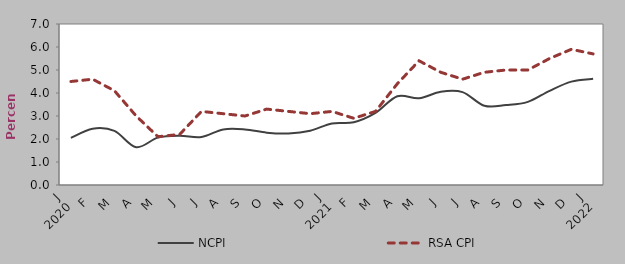
| Category | NCPI | RSA CPI |
|---|---|---|
| 0 | 2.05 | 4.5 |
| 1900-01-01 | 2.45 | 4.6 |
| 1900-01-02 | 2.354 | 4.1 |
| 1900-01-03 | 1.643 | 3 |
| 1900-01-04 | 2.06 | 2.1 |
| 1900-01-05 | 2.145 | 2.2 |
| 1900-01-06 | 2.087 | 3.2 |
| 1900-01-07 | 2.416 | 3.1 |
| 1900-01-08 | 2.416 | 3 |
| 1900-01-09 | 2.277 | 3.3 |
| 1900-01-10 | 2.242 | 3.2 |
| 1900-01-11 | 2.361 | 3.1 |
| 1900-01-12 | 2.676 | 3.2 |
| 1900-01-13 | 2.728 | 2.9 |
| 1900-01-14 | 3.133 | 3.2 |
| 1900-01-15 | 3.861 | 4.4 |
| 1900-01-16 | 3.769 | 5.4 |
| 1900-01-17 | 4.057 | 4.9 |
| 1900-01-18 | 4.038 | 4.6 |
| 1900-01-19 | 3.445 | 4.9 |
| 1900-01-20 | 3.474 | 5 |
| 1900-01-21 | 3.612 | 5 |
| 1900-01-22 | 4.095 | 5.5 |
| 1900-01-23 | 4.494 | 5.9 |
| 1900-01-24 | 4.618 | 5.7 |